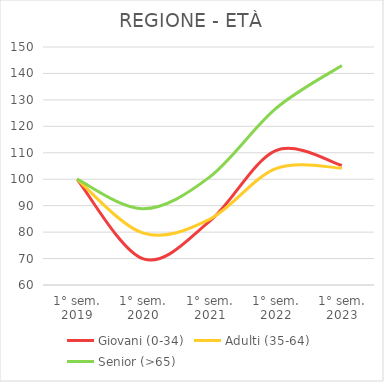
| Category | Giovani (0-34) | Adulti (35-64) | Senior (>65) |
|---|---|---|---|
| 1° sem.
2019 | 100 | 100 | 100 |
| 1° sem.
2020 | 69.892 | 79.6 | 88.835 |
| 1° sem.
2021 | 84.043 | 84.824 | 100.779 |
| 1° sem.
2022 | 110.794 | 104.032 | 126.706 |
| 1° sem.
2023 | 105.24 | 104.218 | 142.99 |